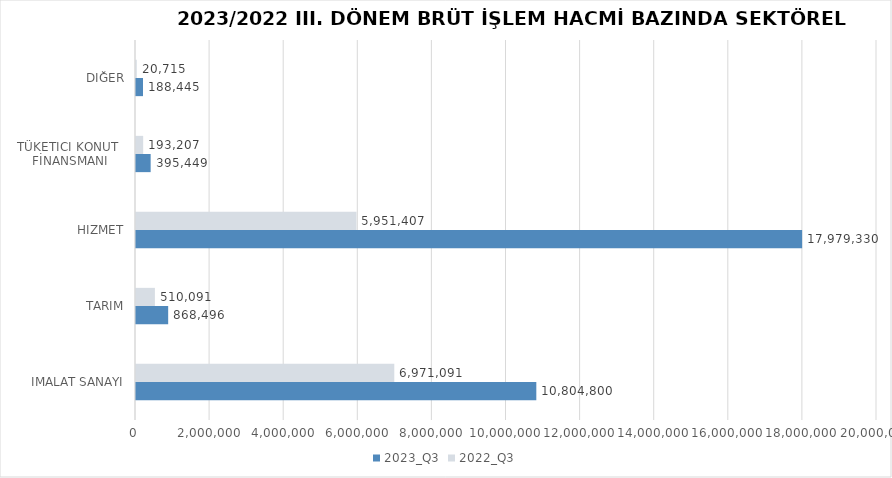
| Category | 2023_Q3 | 2022_Q3 |
|---|---|---|
| İMALAT SANAYİ | 10804800.443 | 6971091 |
| TARIM | 868496.423 | 510091 |
| HİZMET | 17979329.583 | 5951407 |
| TÜKETİCİ KONUT 
FİNANSMANI | 395449 | 193207 |
| DİĞER | 188445 | 20715 |